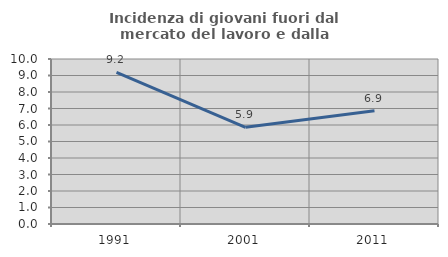
| Category | Incidenza di giovani fuori dal mercato del lavoro e dalla formazione  |
|---|---|
| 1991.0 | 9.187 |
| 2001.0 | 5.862 |
| 2011.0 | 6.862 |